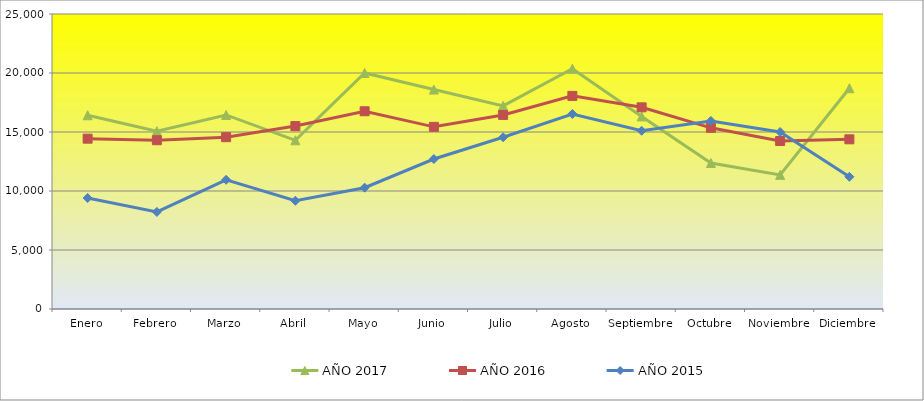
| Category | AÑO 2017 | AÑO 2016 | AÑO 2015 |
|---|---|---|---|
| Enero | 16418.687 | 14435 | 9403 |
| Febrero | 15068.759 | 14304 | 8229 |
| Marzo | 16444.075 | 14561 | 10947 |
| Abril | 14296.548 | 15502 | 9173 |
| Mayo | 19999.286 | 16758 | 10281 |
| Junio | 18595.179 | 15437 | 12710 |
| Julio | 17215.714 | 16447 | 14552 |
| Agosto | 20366.25 | 18060 | 16529 |
| Septiembre | 16320.536 | 17090 | 15105 |
| Octubre | 12372.493 | 15353 | 15938 |
| Noviembre | 11366.707 | 14235 | 14997 |
| Diciembre | 18709.821 | 14380 | 11203 |